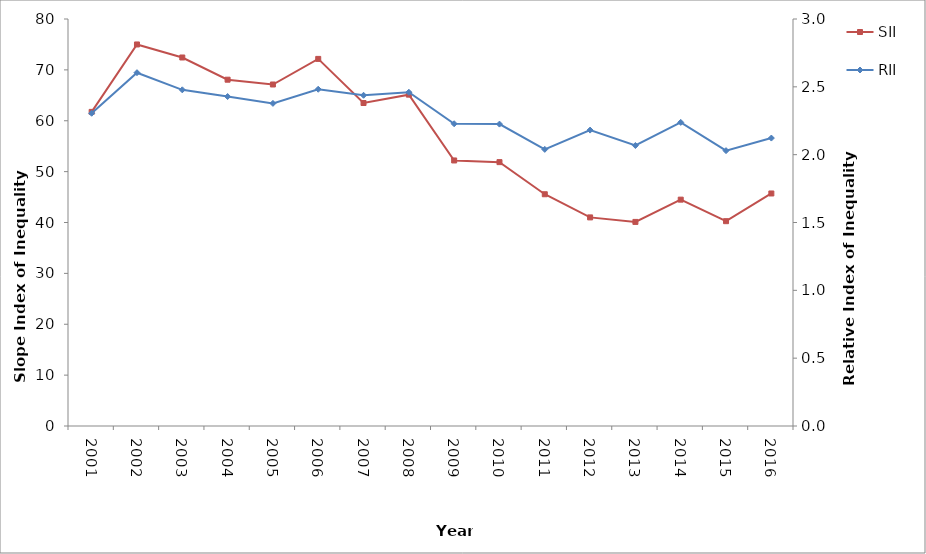
| Category | SII |
|---|---|
| 2001.0 | 61.742 |
| 2002.0 | 74.995 |
| 2003.0 | 72.434 |
| 2004.0 | 68.068 |
| 2005.0 | 67.126 |
| 2006.0 | 72.159 |
| 2007.0 | 63.487 |
| 2008.0 | 65.131 |
| 2009.0 | 52.194 |
| 2010.0 | 51.865 |
| 2011.0 | 45.554 |
| 2012.0 | 41.003 |
| 2013.0 | 40.117 |
| 2014.0 | 44.493 |
| 2015.0 | 40.26 |
| 2016.0 | 45.705 |